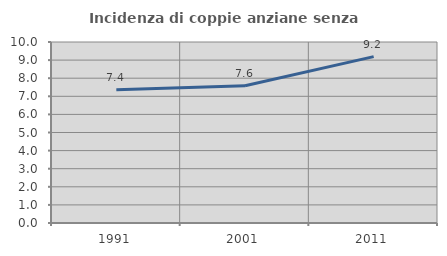
| Category | Incidenza di coppie anziane senza figli  |
|---|---|
| 1991.0 | 7.358 |
| 2001.0 | 7.58 |
| 2011.0 | 9.19 |